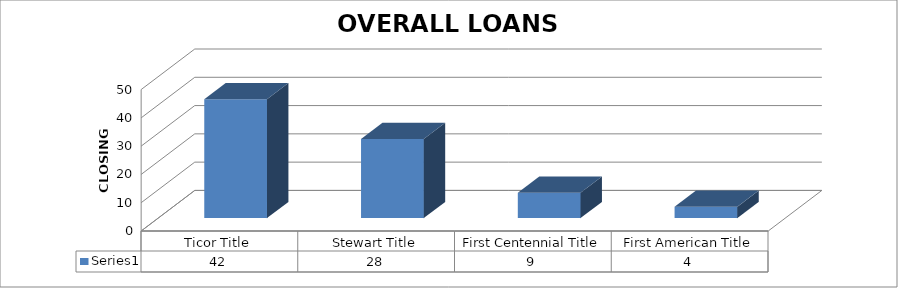
| Category | Series 0 |
|---|---|
| Ticor Title | 42 |
| Stewart Title | 28 |
| First Centennial Title | 9 |
| First American Title | 4 |